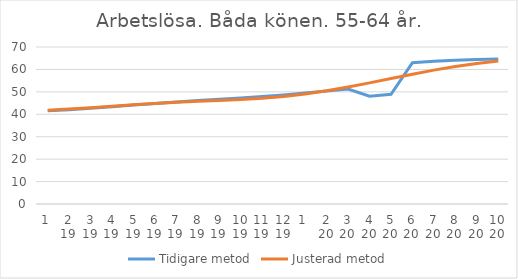
| Category | Tidigare metod | Justerad metod |
|---|---|---|
| 0 | 41.59 | 41.78 |
| 1 | 42.04 | 42.31 |
| 2 | 42.66 | 42.94 |
| 3 | 43.38 | 43.61 |
| 4 | 44.13 | 44.25 |
| 5 | 44.85 | 44.84 |
| 6 | 45.53 | 45.38 |
| 7 | 46.15 | 45.81 |
| 8 | 46.72 | 46.18 |
| 9 | 47.28 | 46.57 |
| 10 | 47.92 | 47.13 |
| 11 | 48.65 | 47.94 |
| 12 | 49.47 | 49.05 |
| 13 | 50.36 | 50.47 |
| 14 | 51.27 | 52.14 |
| 15 | 48.04 | 54 |
| 16 | 48.88 | 55.94 |
| 17 | 63.01 | 57.89 |
| 18 | 63.61 | 59.7 |
| 19 | 64.08 | 61.31 |
| 20 | 64.42 | 62.67 |
| 21 | 64.68 | 63.77 |